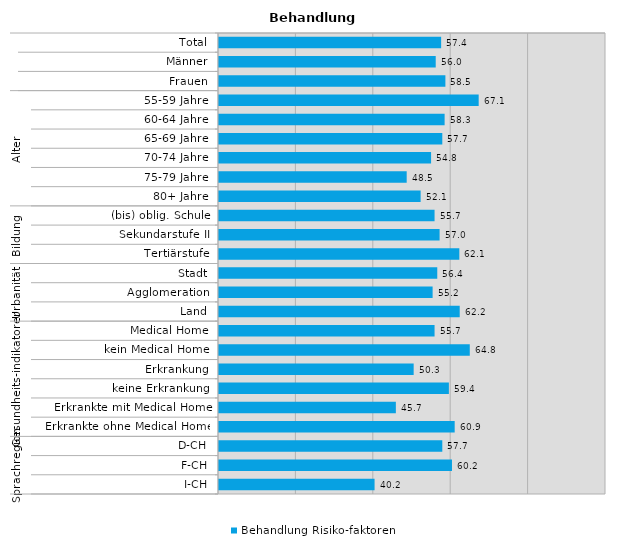
| Category | Behandlung Risiko-faktoren |
|---|---|
| 0 | 57.4 |
| 1 | 56 |
| 2 | 58.5 |
| 3 | 67.1 |
| 4 | 58.3 |
| 5 | 57.7 |
| 6 | 54.8 |
| 7 | 48.5 |
| 8 | 52.1 |
| 9 | 55.7 |
| 10 | 57 |
| 11 | 62.1 |
| 12 | 56.4 |
| 13 | 55.2 |
| 14 | 62.2 |
| 15 | 55.7 |
| 16 | 64.8 |
| 17 | 50.3 |
| 18 | 59.4 |
| 19 | 45.7 |
| 20 | 60.9 |
| 21 | 57.7 |
| 22 | 60.2 |
| 23 | 40.2 |